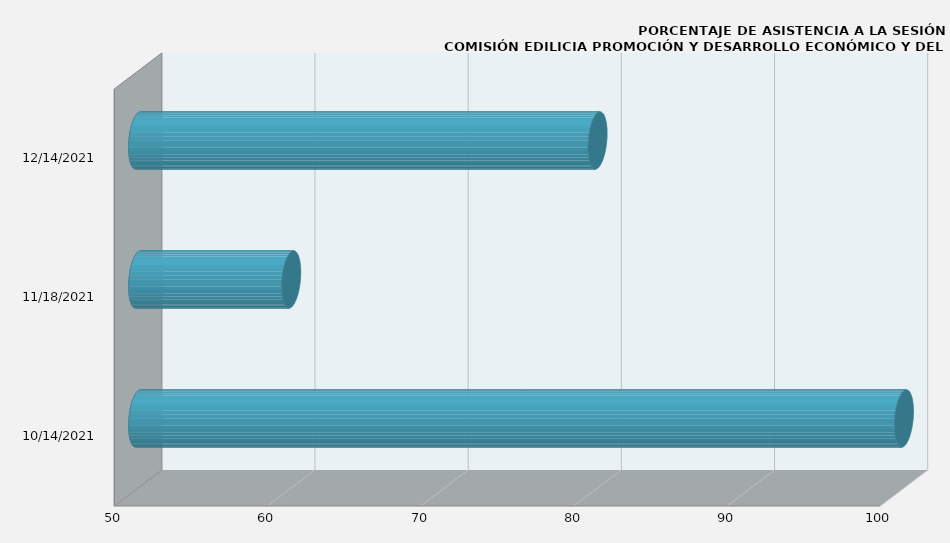
| Category | Series 0 |
|---|---|
| 10/14/21 | 100 |
| 11/18/21 | 60 |
| 12/14/21 | 80 |